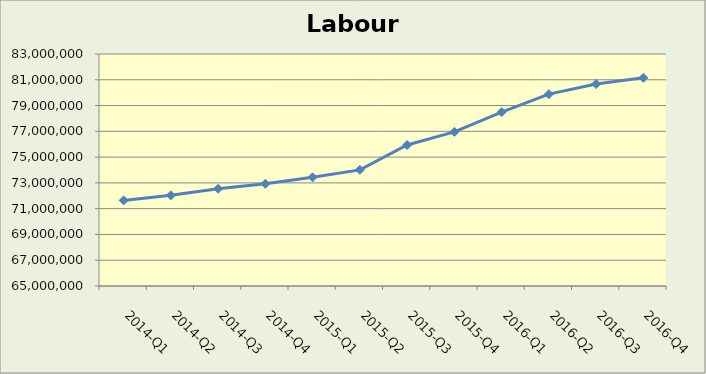
| Category | Labour Force |
|---|---|
| 2014-Q1 | 71641170.877 |
| 2014-Q2 | 72037644.865 |
| 2014-Q3 | 72545834 |
| 2014-Q4 | 72931608.237 |
| 2015-Q1 | 73436104.383 |
| 2015-Q2 | 74010602.141 |
| 2015-Q3 | 75940402 |
| 2015-Q4 | 76957923 |
| 2016-Q1 | 78486570 |
| 2016-Q2 | 79886310 |
| 2016-Q3 | 80669195.838 |
| 2016-Q4 | 81151885 |